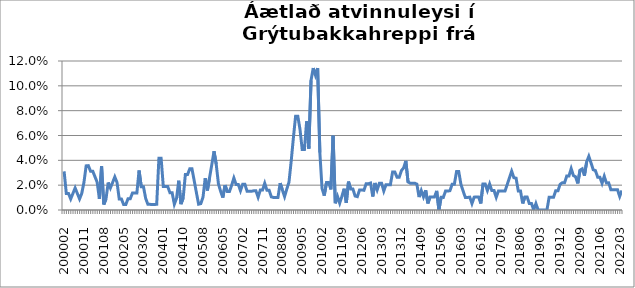
| Category | Series 0 |
|---|---|
| 200002 | 0.031 |
| 200003 | 0.013 |
| 200004 | 0.013 |
| 200005 | 0.009 |
| 200006 | 0.013 |
| 200007 | 0.018 |
| 200008 | 0.013 |
| 200009 | 0.009 |
| 200010 | 0.013 |
| 200011 | 0.022 |
| 200012 | 0.036 |
| 200101 | 0.036 |
| 200102 | 0.031 |
| 200103 | 0.031 |
| 200104 | 0.027 |
| 200105 | 0.022 |
| 200106 | 0.009 |
| 200107 | 0.035 |
| 200108 | 0.004 |
| 200109 | 0.009 |
| 200110 | 0.022 |
| 200111 | 0.018 |
| 200112 | 0.022 |
| 200201 | 0.027 |
| 200202 | 0.022 |
| 200203 | 0.009 |
| 200204 | 0.009 |
| 200205 | 0.004 |
| 200206 | 0.004 |
| 200207 | 0.009 |
| 200208 | 0.009 |
| 200209 | 0.014 |
| 200210 | 0.014 |
| 200211 | 0.014 |
| 200212 | 0.032 |
| 200301 | 0.019 |
| 200302 | 0.019 |
| 200303 | 0.009 |
| 200304 | 0.005 |
| 200305 | 0.005 |
| 200308 | 0.004 |
| 200309 | 0.004 |
| 200310 | 0.005 |
| 200311 | 0.042 |
| 200312 | 0.042 |
| 200401 | 0.019 |
| 200402 | 0.019 |
| 200403 | 0.019 |
| 200404 | 0.014 |
| 200405 | 0.014 |
| 200406 | 0.005 |
| 200407 | 0.009 |
| 200408 | 0.024 |
| 200409 | 0.005 |
| 200410 | 0.01 |
| 200411 | 0.029 |
| 200412 | 0.029 |
| 200501 | 0.033 |
| 200502 | 0.033 |
| 200503 | 0.024 |
| 200504 | 0.014 |
| 200505 | 0.005 |
| 200507 | 0.005 |
| 200508 | 0.01 |
| 200509 | 0.026 |
| 200510 | 0.016 |
| 200511 | 0.026 |
| 200512 | 0.037 |
| 200601 | 0.047 |
| 200602 | 0.037 |
| 200603 | 0.021 |
| 200604 | 0.015 |
| 200605 | 0.01 |
| 200606 | 0.02 |
| 200607 | 0.015 |
| 200608 | 0.015 |
| 200609 | 0.02 |
| 200610 | 0.026 |
| 200611 | 0.021 |
| 200612 | 0.021 |
| 200701 | 0.016 |
| 200702 | 0.021 |
| 200703 | 0.021 |
| 200704 | 0.015 |
| 200705 | 0.015 |
| 200706 | 0.015 |
| 200707 | 0.015 |
| 200708 | 0.015 |
| 200709 | 0.01 |
| 200710 | 0.016 |
| 200711 | 0.016 |
| 200712 | 0.022 |
| 200801 | 0.016 |
| 200802 | 0.016 |
| 200803 | 0.011 |
| 200804 | 0.01 |
| 200805 | 0.01 |
| 200806 | 0.01 |
| 200807 | 0.022 |
| 200808 | 0.016 |
| 200809 | 0.011 |
| 200810 | 0.017 |
| 200811 | 0.022 |
| 200812 | 0.039 |
| 200901 | 0.058 |
| 200902 | 0.076 |
| 200903 | 0.076 |
| 200904 | 0.065 |
| 200905 | 0.049 |
| 200906 | 0.049 |
| 200907 | 0.071 |
| 200908 | 0.049 |
| 200909 | 0.104 |
| 200910 | 0.114 |
| 200911 | 0.109 |
| 200912 | 0.114 |
| 201001 | 0.046 |
| 201002 | 0.017 |
| 201003 | 0.012 |
| 201004 | 0.022 |
| 201005 | 0.022 |
| 201006 | 0.017 |
| 201007 | 0.06 |
| 201008 | 0.005 |
| 201107 | 0.011 |
| 201108 | 0.005 |
| 201109 | 0.011 |
| 201110 | 0.017 |
| 201111 | 0.006 |
| 201112 | 0.023 |
| 201201 | 0.017 |
| 201202 | 0.017 |
| 201203 | 0.011 |
| 201204 | 0.011 |
| 201205 | 0.016 |
| 201206 | 0.016 |
| 201207 | 0.016 |
| 201208 | 0.021 |
| 201209 | 0.021 |
| 201210 | 0.022 |
| 201211 | 0.011 |
| 201212 | 0.022 |
| 201301 | 0.016 |
| 201302 | 0.022 |
| 201303 | 0.022 |
| 201304 | 0.015 |
| 201305 | 0.02 |
| 201306 | 0.02 |
| 201307 | 0.02 |
| 201308 | 0.031 |
| 201309 | 0.031 |
| 201310 | 0.026 |
| 201311 | 0.026 |
| 201312 | 0.032 |
| 201401 | 0.034 |
| 201402 | 0.04 |
| 201403 | 0.023 |
| 201404 | 0.022 |
| 201405 | 0.022 |
| 201406 | 0.022 |
| 201407 | 0.021 |
| 201408 | 0.01 |
| 201409 | 0.016 |
| 201410 | 0.011 |
| 201411 | 0.016 |
| 201412 | 0.005 |
| 201501 | 0.011 |
| 201502 | 0.011 |
| 201503 | 0.011 |
| 201504 | 0.015 |
| 201505 | 0 |
| 201506 | 0.01 |
| 201507 | 0.01 |
| 201508 | 0.015 |
| 201509 | 0.015 |
| 201510 | 0.016 |
| 201511 | 0.021 |
| 201512 | 0.021 |
| 201601 | 0.031 |
| 201602 | 0.031 |
| 201603 | 0.021 |
| 201604 | 0.015 |
| 201605 | 0.01 |
| 201606 | 0.01 |
| 201607 | 0.01 |
| 201608 | 0.005 |
| 201609 | 0.01 |
| 201610 | 0.01 |
| 201611 | 0.01 |
| 201612 | 0.005 |
| 201701 | 0.021 |
| 201702 | 0.021 |
| 201703 | 0.016 |
| 201704 | 0.021 |
| 201705 | 0.016 |
| 201706 | 0.016 |
| 201707 | 0.01 |
| 201708 | 0.015 |
| 201709 | 0.015 |
| 201710 | 0.015 |
| 201711 | 0.015 |
| 201712 | 0.021 |
| 201801 | 0.026 |
| 201802 | 0.031 |
| 201803 | 0.026 |
| 201804 | 0.026 |
| 201805 | 0.015 |
| 201806 | 0.015 |
| 201807 | 0.005 |
| 201808 | 0.011 |
| 201809 | 0.011 |
| 201810 | 0.005 |
| 201811 | 0.005 |
| 201812 | 0 |
| 201901 | 0.005 |
| 201902 | 0 |
| 201903 | 0 |
| 201904 | 0 |
| 201905 | 0 |
| 201906 | 0 |
| 201907 | 0.01 |
| 201908 | 0.01 |
| 201909 | 0.01 |
| 201910 | 0.016 |
| 201911 | 0.016 |
| 201912 | 0.021 |
| 202001 | 0.022 |
| 202002 | 0.022 |
| 202003 | 0.027 |
| 202004 | 0.027 |
| 202005 | 0.033 |
| 202006 | 0.028 |
| 202007 | 0.027 |
| 202008 | 0.021 |
| 202009 | 0.032 |
| 202010 | 0.033 |
| 202011 | 0.028 |
| 202012 | 0.039 |
| 202101 | 0.043 |
| 202102 | 0.038 |
| 202103 | 0.032 |
| 202104 | 0.032 |
| 202105 | 0.026 |
| 202106 | 0.026 |
| 202107 | 0.022 |
| 202108 | 0.027 |
| 202109 | 0.022 |
| 202110 | 0.022 |
| 202111 | 0.016 |
| 202112 | 0.016 |
| 202201 | 0.016 |
| 202202 | 0.016 |
| 202203 | 0.011 |
| 202204 | 0.016 |